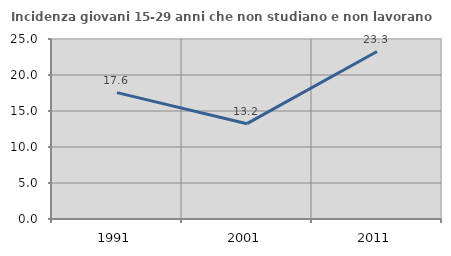
| Category | Incidenza giovani 15-29 anni che non studiano e non lavorano  |
|---|---|
| 1991.0 | 17.556 |
| 2001.0 | 13.241 |
| 2011.0 | 23.262 |